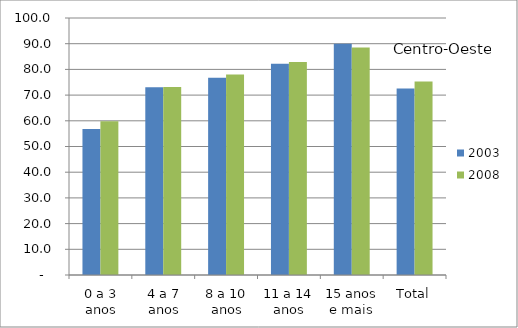
| Category | 2003 | 2008 |
|---|---|---|
| 0 a 3 anos | 56.81 | 59.81 |
| 4 a 7 anos | 73.03 | 73.17 |
| 8 a 10 anos | 76.73 | 77.97 |
| 11 a 14 anos | 82.23 | 82.86 |
| 15 anos e mais | 90 | 88.48 |
| Total | 72.55 | 75.33 |